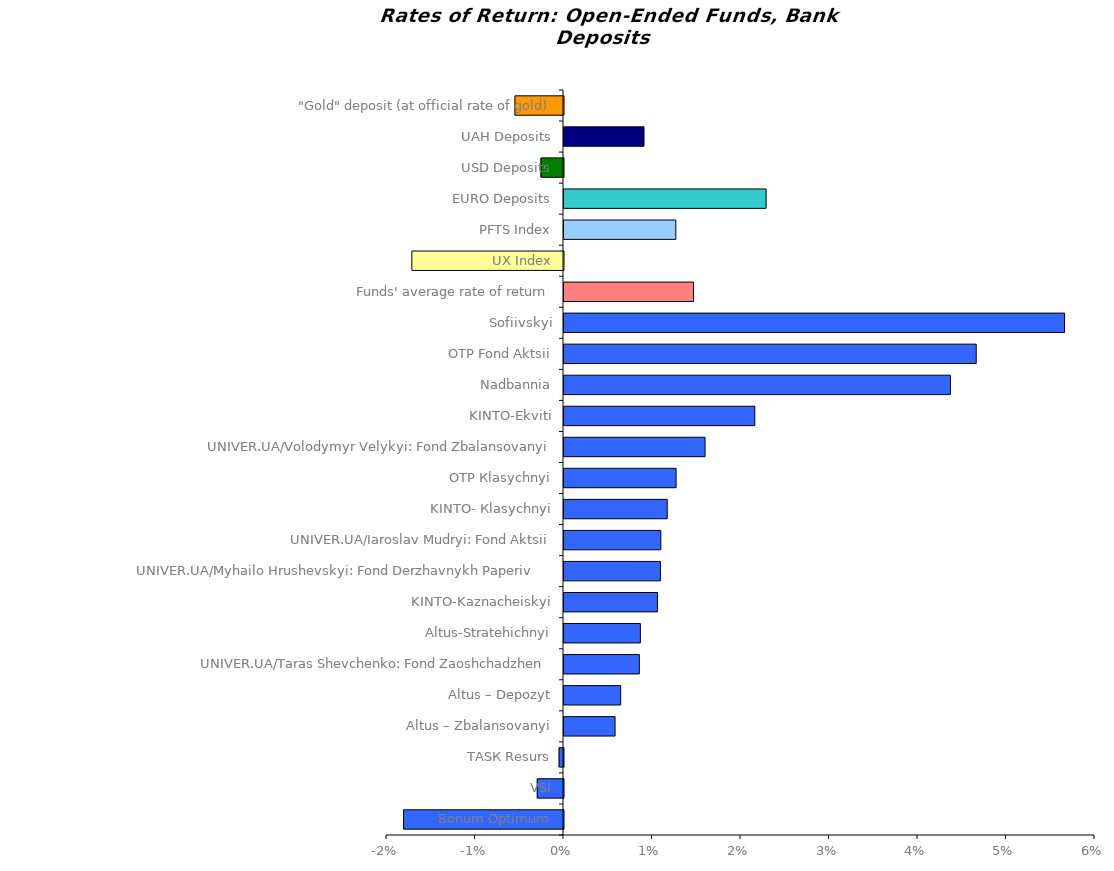
| Category | Series 0 |
|---|---|
| Bonum Optimum | -0.018 |
| VSI | -0.003 |
| ТАSК Resurs | 0 |
| Altus – Zbalansovanyi | 0.006 |
| Altus – Depozyt | 0.006 |
| UNIVER.UA/Taras Shevchenko: Fond Zaoshchadzhen | 0.009 |
| Altus-Stratehichnyi | 0.009 |
| KINTO-Kaznacheiskyi | 0.011 |
| UNIVER.UA/Myhailo Hrushevskyi: Fond Derzhavnykh Paperiv    | 0.011 |
| UNIVER.UA/Iaroslav Mudryi: Fond Aktsii | 0.011 |
| KINTO- Кlasychnyi | 0.012 |
| OTP Кlasychnyi | 0.013 |
| UNIVER.UA/Volodymyr Velykyi: Fond Zbalansovanyi | 0.016 |
| KINTO-Ekviti | 0.022 |
| Nadbannia | 0.044 |
| ОТP Fond Aktsii | 0.047 |
| Sofiivskyi | 0.057 |
| Funds' average rate of return | 0.015 |
| UX Index | -0.017 |
| PFTS Index | 0.013 |
| EURO Deposits | 0.023 |
| USD Deposits | -0.003 |
| UAH Deposits | 0.009 |
| "Gold" deposit (at official rate of gold) | -0.005 |